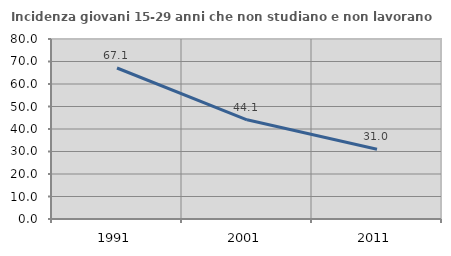
| Category | Incidenza giovani 15-29 anni che non studiano e non lavorano  |
|---|---|
| 1991.0 | 67.104 |
| 2001.0 | 44.089 |
| 2011.0 | 30.973 |